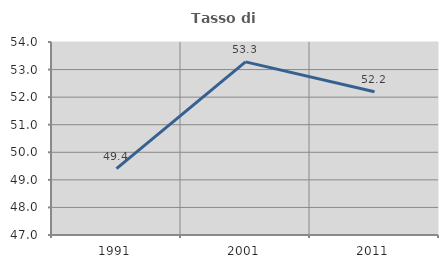
| Category | Tasso di occupazione   |
|---|---|
| 1991.0 | 49.41 |
| 2001.0 | 53.28 |
| 2011.0 | 52.195 |